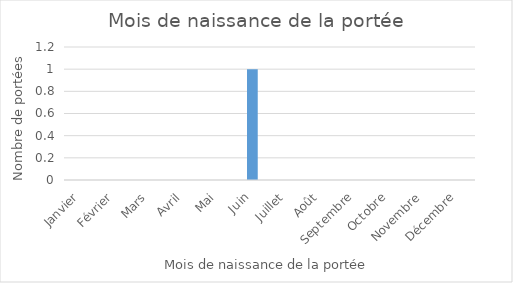
| Category | Series 0 |
|---|---|
| Janvier | 0 |
| Février | 0 |
| Mars | 0 |
| Avril | 0 |
| Mai | 0 |
| Juin | 1 |
| Juillet | 0 |
| Août | 0 |
| Septembre | 0 |
| Octobre | 0 |
| Novembre | 0 |
| Décembre | 0 |